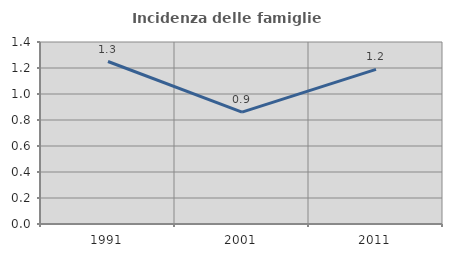
| Category | Incidenza delle famiglie numerose |
|---|---|
| 1991.0 | 1.25 |
| 2001.0 | 0.861 |
| 2011.0 | 1.189 |